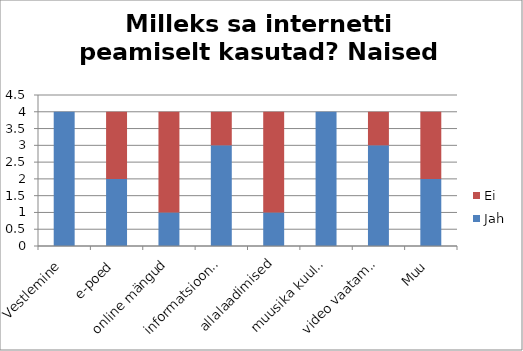
| Category | Jah | Ei |
|---|---|---|
| Vestlemine | 4 | 0 |
| e-poed | 2 | 2 |
| online mängud | 1 | 3 |
| informatsioon/haridus | 3 | 1 |
| allalaadimised | 1 | 3 |
| muusika kuulamine | 4 | 0 |
| video vaatamine netis | 3 | 1 |
| Muu | 2 | 2 |